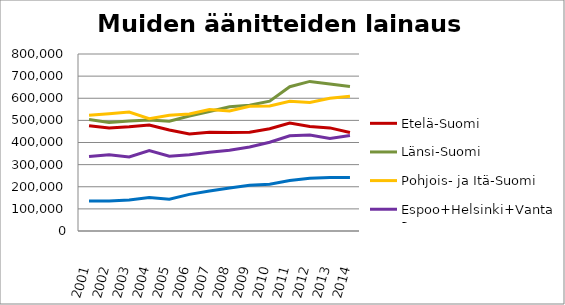
| Category | Etelä-Suomi | Länsi-Suomi | Pohjois- ja Itä-Suomi | Espoo+Helsinki+Vantaa | Muu Uusimaa |
|---|---|---|---|---|---|
| 2001.0 | 476175 | 503989 | 522977 | 337169 | 135199 |
| 2002.0 | 465440 | 490369 | 529613 | 345130 | 135433 |
| 2003.0 | 470803 | 497578 | 537945 | 334756 | 140294 |
| 2004.0 | 479333 | 501188 | 507498 | 363979 | 151441 |
| 2005.0 | 456679 | 496019 | 523612 | 337734 | 143402 |
| 2006.0 | 438677 | 519922 | 528758 | 344343 | 165532 |
| 2007.0 | 446854 | 540141 | 549394 | 355523 | 180942 |
| 2008.0 | 444823 | 561512 | 542628 | 364665 | 194369 |
| 2009.0 | 446396 | 568150 | 563717 | 379682 | 206239 |
| 2010.0 | 462101 | 587105 | 565112 | 401092 | 210905 |
| 2011.0 | 488058 | 651960 | 585893 | 430405 | 228242 |
| 2012.0 | 472165 | 676089 | 580923 | 433561 | 238101 |
| 2013.0 | 466010 | 663975 | 600264 | 418249 | 241838 |
| 2014.0 | 445097 | 652792 | 608681 | 431782 | 241376 |